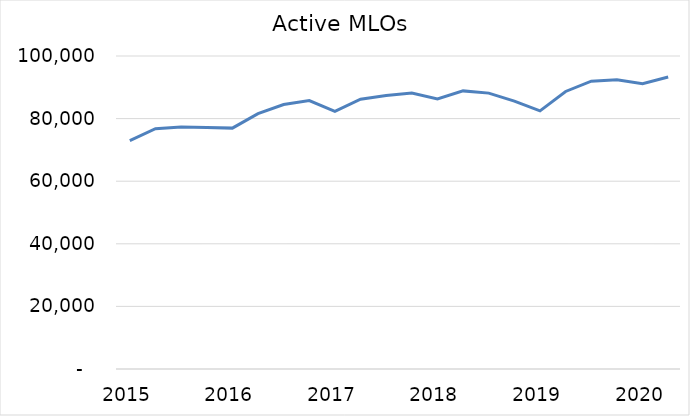
| Category | Active MLOs |
|---|---|
| 2015 | 72971 |
| 2015 | 76764 |
| 2015 | 77304 |
| 2015 | 77175 |
| 2016 | 76959 |
| 2016 | 81606 |
| 2016 | 84484 |
| 2016 | 85755 |
| 2017 | 82276 |
| 2017 | 86190 |
| 2017 | 87405 |
| 2017 | 88205 |
| 2018 | 86269 |
| 2018 | 88855 |
| 2018 | 88144 |
| 2018 | 85589 |
| 2019 | 82457 |
| 2019 | 88669 |
| 2019 | 91959 |
| 2019 | 92376 |
| 2020 | 91167 |
| 2020 | 93279 |